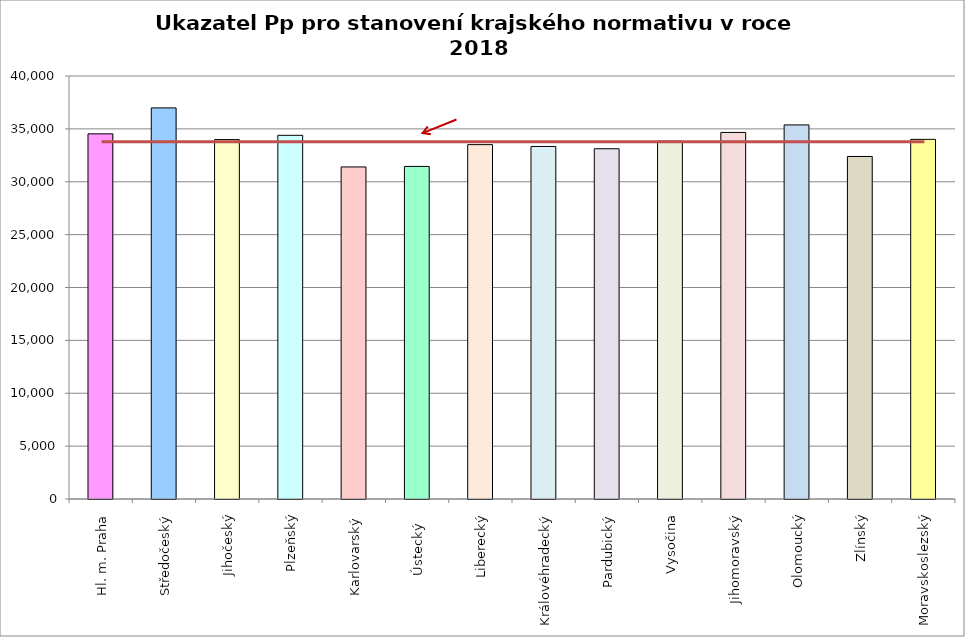
| Category | Series 0 |
|---|---|
| Hl. m. Praha | 34530 |
| Středočeský | 36984 |
| Jihočeský | 33987 |
| Plzeňský | 34391 |
| Karlovarský  | 31400 |
| Ústecký   | 31448 |
| Liberecký | 33510 |
| Královéhradecký | 33337 |
| Pardubický | 33121 |
| Vysočina | 33839 |
| Jihomoravský | 34664 |
| Olomoucký | 35375 |
| Zlínský | 32390 |
| Moravskoslezský | 34010 |